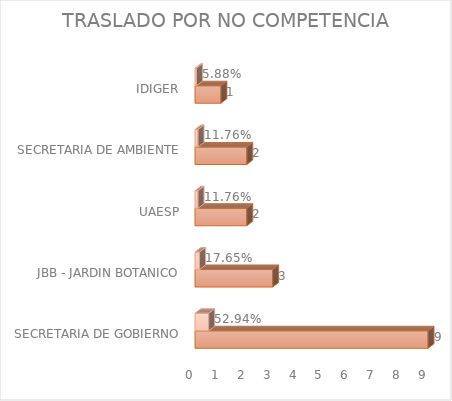
| Category | Cuenta de Número petición | Cuenta de Número petición2 |
|---|---|---|
| SECRETARIA DE GOBIERNO | 9 | 0.529 |
| JBB - JARDIN BOTANICO | 3 | 0.176 |
| UAESP | 2 | 0.118 |
| SECRETARIA DE AMBIENTE | 2 | 0.118 |
| IDIGER | 1 | 0.059 |